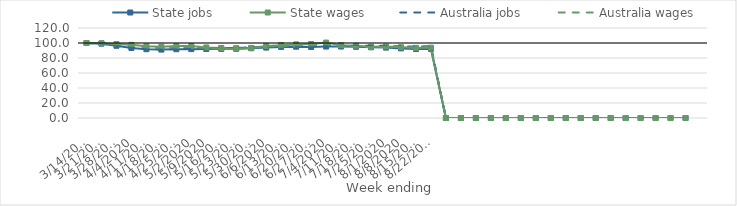
| Category | State jobs | State wages | Australia jobs | Australia wages |
|---|---|---|---|---|
| 14/03/2020 | 100 | 100 | 100 | 100 |
| 21/03/2020 | 99.085 | 99.674 | 99.297 | 99.676 |
| 28/03/2020 | 96.281 | 98.638 | 96.353 | 98.41 |
| 04/04/2020 | 93.324 | 97.525 | 93.695 | 96.734 |
| 11/04/2020 | 91.714 | 95.566 | 91.951 | 94.156 |
| 18/04/2020 | 91.205 | 95.057 | 91.482 | 94.08 |
| 25/04/2020 | 91.714 | 95.857 | 91.798 | 94.248 |
| 02/05/2020 | 91.832 | 96.049 | 92.191 | 94.724 |
| 09/05/2020 | 92.004 | 94.077 | 92.737 | 93.356 |
| 16/05/2020 | 92.195 | 93.336 | 93.262 | 92.686 |
| 23/05/2020 | 92.345 | 93.038 | 93.563 | 92.308 |
| 30/05/2020 | 93.008 | 93.363 | 94.077 | 93.6 |
| 06/06/2020 | 93.89 | 96.114 | 95.016 | 95.393 |
| 13/06/2020 | 94.775 | 97.152 | 95.489 | 96.094 |
| 20/06/2020 | 95.063 | 98.162 | 95.696 | 96.969 |
| 27/06/2020 | 94.616 | 98.683 | 95.581 | 96.996 |
| 04/07/2020 | 95.262 | 100.575 | 96.174 | 98.514 |
| 11/07/2020 | 95.268 | 97.038 | 96.395 | 95.769 |
| 18/07/2020 | 94.966 | 96.416 | 96.226 | 95.048 |
| 25/07/2020 | 94.301 | 94.901 | 96.271 | 94.643 |
| 01/08/2020 | 93.839 | 95.346 | 96.155 | 94.947 |
| 08/08/2020 | 92.797 | 94.358 | 95.543 | 94.567 |
| 15/08/2020 | 92.028 | 93.53 | 95.204 | 94.097 |
| 22/08/2020 | 92.106 | 93.81 | 95.812 | 94.778 |